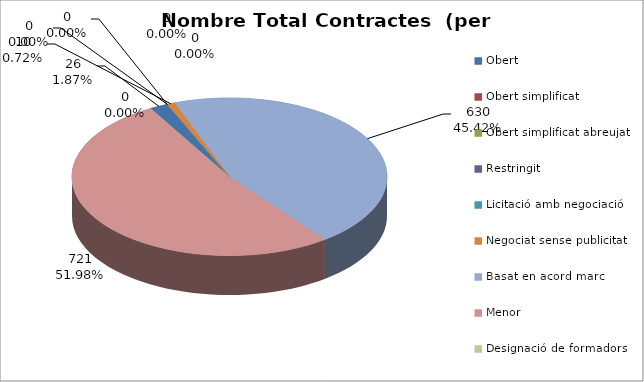
| Category | Nombre Total Contractes |
|---|---|
| Obert | 26 |
| Obert simplificat | 0 |
| Obert simplificat abreujat | 0 |
| Restringit | 0 |
| Licitació amb negociació | 0 |
| Negociat sense publicitat | 10 |
| Basat en acord marc | 630 |
| Menor | 721 |
| Designació de formadors | 0 |